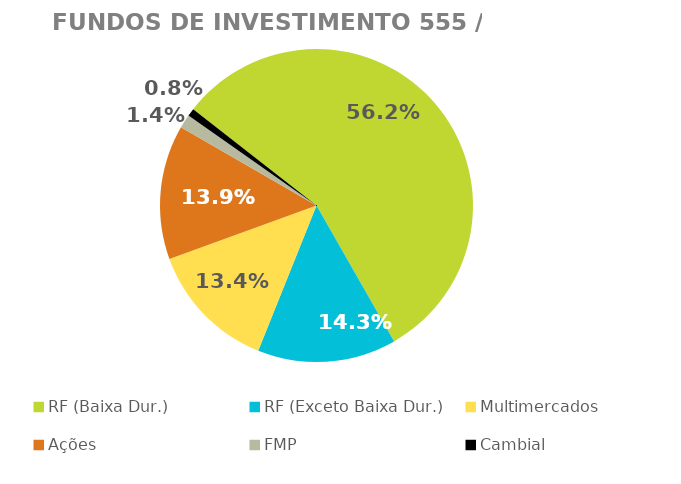
| Category | Fundos de Investimento 555 / FMP |
|---|---|
| RF (Baixa Dur.) | 0.562 |
| RF (Exceto Baixa Dur.) | 0.143 |
| Multimercados | 0.134 |
| Ações | 0.139 |
| FMP | 0.014 |
| Cambial | 0.008 |